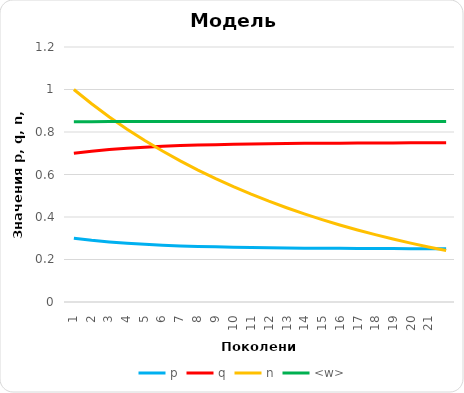
| Category | p | q | n | <w> |
|---|---|---|---|---|
| 1.0 | 0.3 | 0.7 | 1 | 0.848 |
| 2.0 | 0.29 | 0.71 | 0.933 | 0.849 |
| 3.0 | 0.282 | 0.718 | 0.871 | 0.849 |
| 4.0 | 0.276 | 0.724 | 0.813 | 0.849 |
| 5.0 | 0.271 | 0.729 | 0.76 | 0.85 |
| 6.0 | 0.267 | 0.733 | 0.71 | 0.85 |
| 7.0 | 0.264 | 0.736 | 0.664 | 0.85 |
| 8.0 | 0.262 | 0.738 | 0.621 | 0.85 |
| 9.0 | 0.259 | 0.741 | 0.58 | 0.85 |
| 10.0 | 0.258 | 0.742 | 0.543 | 0.85 |
| 11.0 | 0.256 | 0.744 | 0.507 | 0.85 |
| 12.0 | 0.255 | 0.745 | 0.474 | 0.85 |
| 13.0 | 0.254 | 0.746 | 0.443 | 0.85 |
| 14.0 | 0.254 | 0.746 | 0.415 | 0.85 |
| 15.0 | 0.253 | 0.747 | 0.388 | 0.85 |
| 16.0 | 0.252 | 0.748 | 0.362 | 0.85 |
| 17.0 | 0.252 | 0.748 | 0.339 | 0.85 |
| 18.0 | 0.252 | 0.748 | 0.317 | 0.85 |
| 19.0 | 0.251 | 0.749 | 0.296 | 0.85 |
| 20.0 | 0.251 | 0.749 | 0.277 | 0.85 |
| 21.0 | 0.251 | 0.749 | 0.259 | 0.85 |